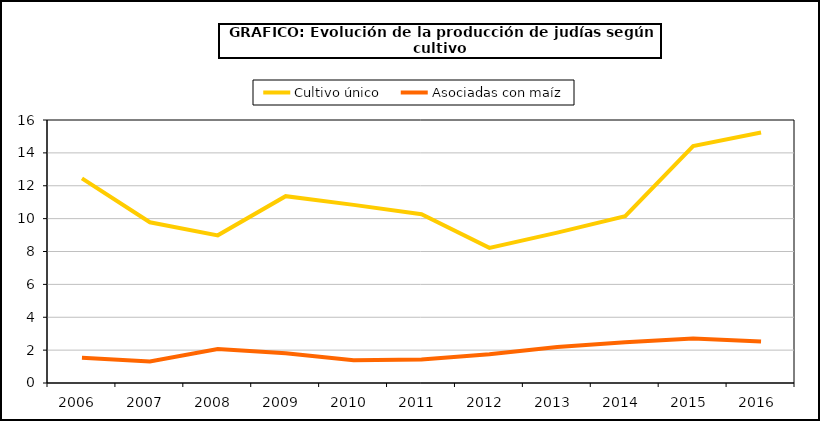
| Category | Cultivo único | Asociadas con maíz |
|---|---|---|
| 2006.0 | 12.447 | 1.536 |
| 2007.0 | 9.779 | 1.306 |
| 2008.0 | 8.983 | 2.065 |
| 2009.0 | 11.367 | 1.808 |
| 2010.0 | 10.837 | 1.389 |
| 2011.0 | 10.269 | 1.432 |
| 2012.0 | 8.22 | 1.751 |
| 2013.0 | 9.15 | 2.187 |
| 2014.0 | 10.155 | 2.474 |
| 2015.0 | 14.413 | 2.712 |
| 2016.0 | 15.236 | 2.525 |